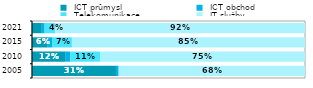
| Category |  ICT průmysl |  ICT obchod |  Telekomunikace |  IT služby  |
|---|---|---|---|---|
| 2005.0 | 0.308 | 0.009 | 0.003 | 0.68 |
| 2010.0 | 0.124 | 0.017 | 0.108 | 0.751 |
| 2015.0 | 0.058 | 0.015 | 0.073 | 0.854 |
| 2021.0 | 0.036 | 0.01 | 0.039 | 0.915 |